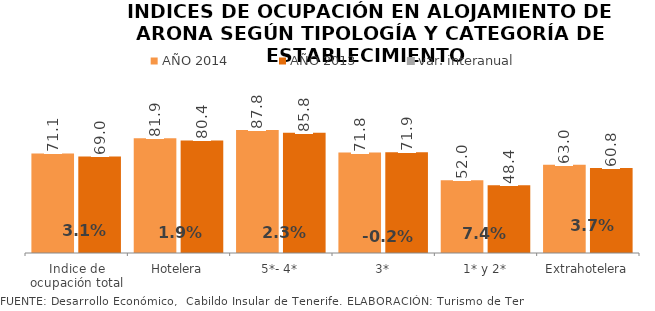
| Category | AÑO 2014 | AÑO 2013 |
|---|---|---|
| Indice de ocupación total | 71.129 | 69.001 |
| Hotelera | 81.92 | 80.409 |
| 5*- 4* | 87.832 | 85.836 |
| 3* | 71.768 | 71.9 |
| 1* y 2* | 52.026 | 48.429 |
| Extrahotelera | 63.021 | 60.762 |